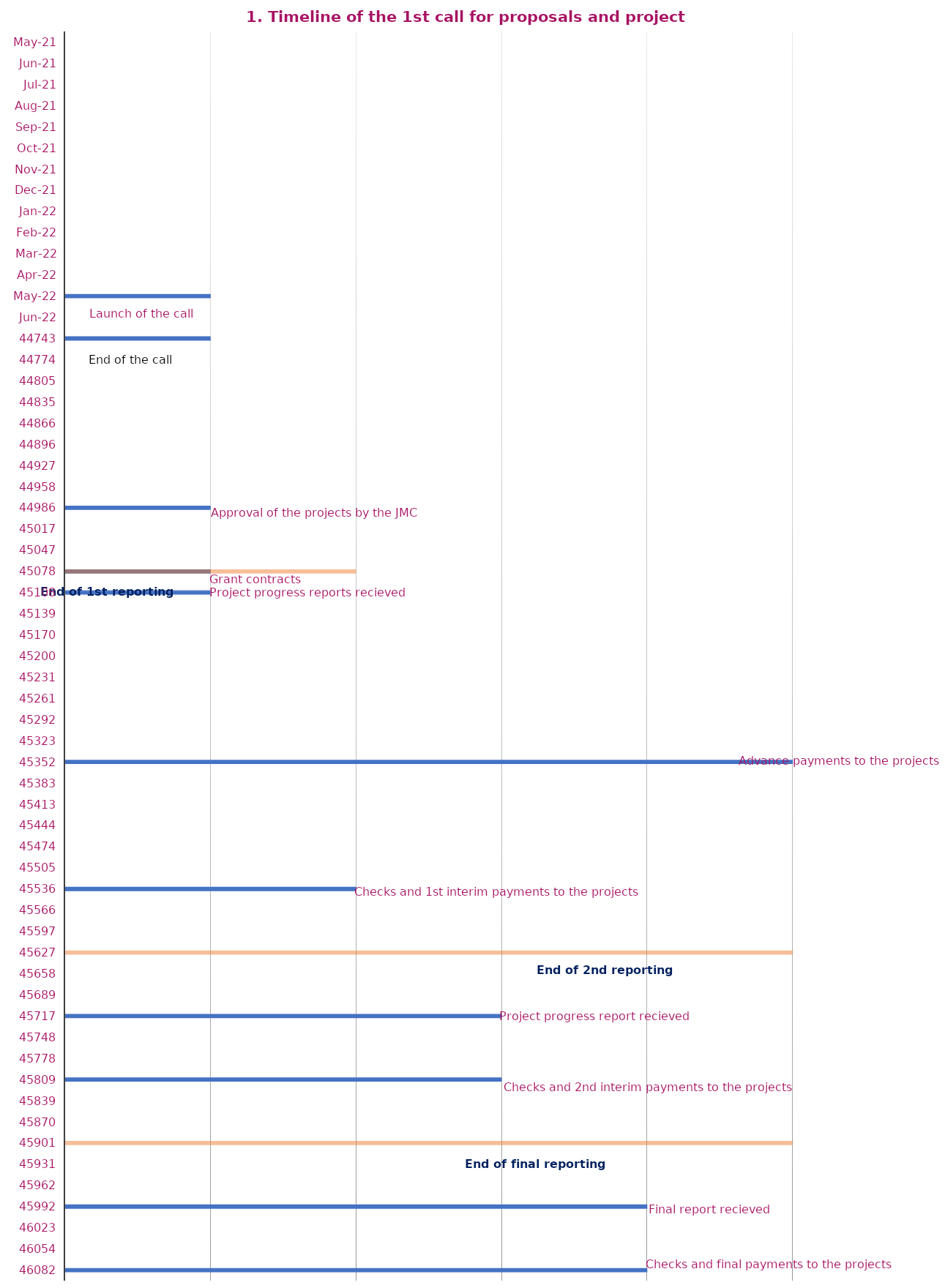
| Category | Simulation of the programme timeline |
|---|---|
| 2022-05-01 | 1 |
| 2022-07-01 | 1 |
| 2023-03-01 | 1 |
| 2023-06-01 | 1 |
| 2023-07-01 | 1 |
| 2024-03-01 | 5 |
| 2023-06-01 | 2 |
| 2024-09-01 | 2 |
| 2024-12-01 | 5 |
| 2025-03-01 | 3 |
| 2025-06-01 | 3 |
| 2025-09-01 | 5 |
| 2025-12-01 | 4 |
| 2026-03-01 | 4 |